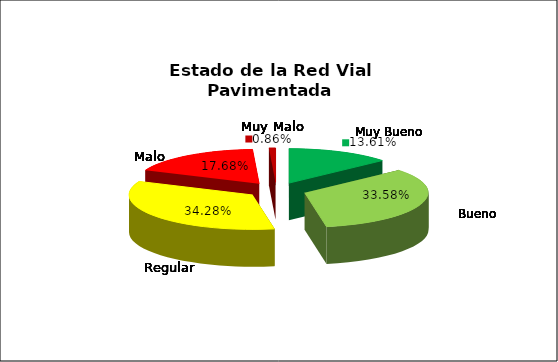
| Category | Series 0 |
|---|---|
| 0 | 0.136 |
| 1 | 0.336 |
| 2 | 0.343 |
| 3 | 0.177 |
| 4 | 0.009 |